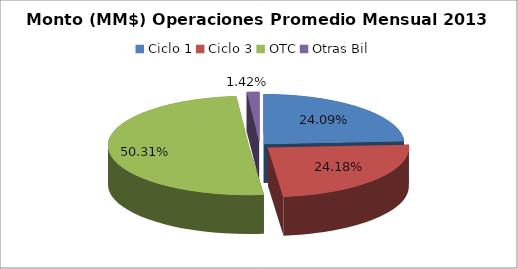
| Category | Series 0 |
|---|---|
| Ciclo 1 | 16030163.865 |
| Ciclo 3 | 16085646.643 |
| OTC | 33474496.134 |
| Otras Bil | 944404.907 |